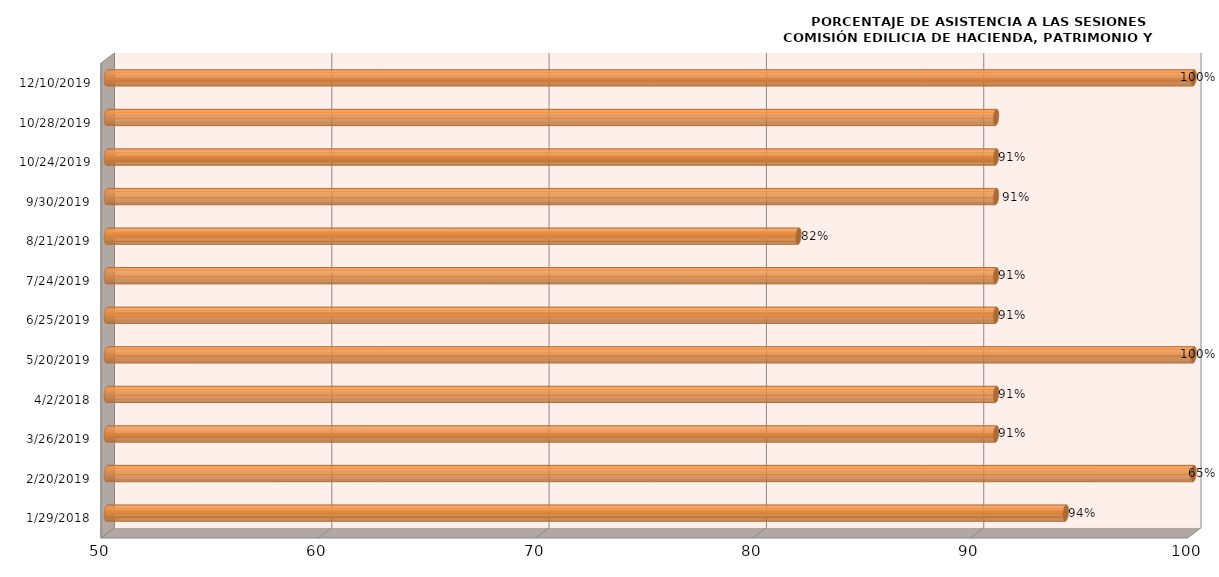
| Category | Series 0 |
|---|---|
| 1/29/18 | 94.118 |
| 2/20/19 | 100 |
| 3/26/19 | 90.909 |
| 4/2/18 | 90.909 |
| 5/20/19 | 100 |
| 6/25/19 | 90.909 |
| 7/24/19 | 90.909 |
| 8/21/19 | 81.818 |
| 9/30/19 | 90.909 |
| 10/24/19 | 90.909 |
| 10/28/19 | 90.909 |
| 12/10/19 | 100 |